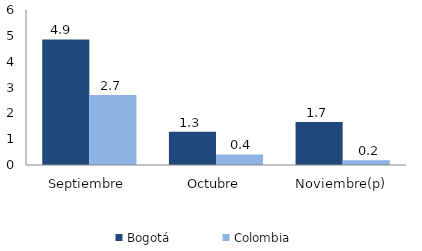
| Category | Bogotá | Colombia |
|---|---|---|
| Septiembre | 4.86 | 2.711 |
| Octubre | 1.283 | 0.408 |
| Noviembre(p) | 1.665 | 0.185 |